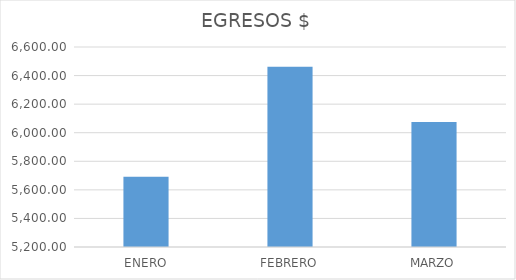
| Category | EGRESOS $ |
|---|---|
| ENERO | 5692.31 |
| FEBRERO | 6461.54 |
| MARZO | 6075.38 |